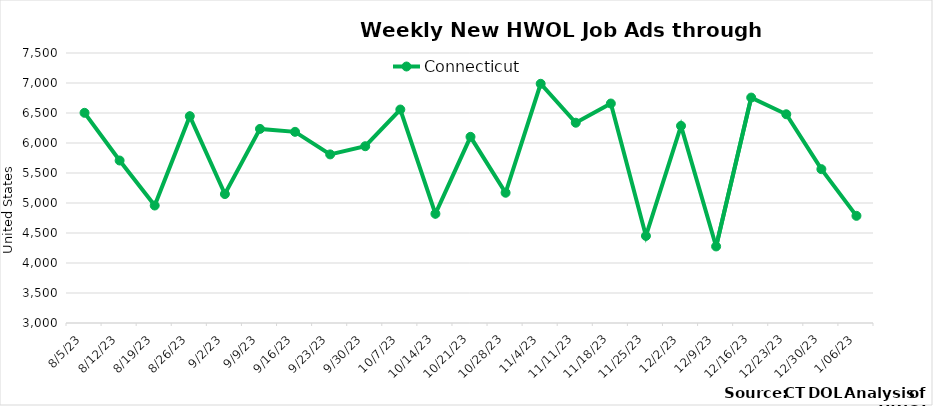
| Category | Connecticut |
|---|---|
| 8/5/23 | 6503 |
| 8/12/23 | 5708 |
| 8/19/23 | 4958 |
| 8/26/23 | 6447 |
| 9/2/23 | 5149 |
| 9/9/23 | 6235 |
| 9/16/23 | 6186 |
| 9/23/23 | 5810 |
| 9/30/23 | 5946 |
| 10/7/23 | 6558 |
| 10/14/23 | 4820 |
| 10/21/23 | 6103 |
| 10/28/23 | 5171 |
| 11/4/23 | 6987 |
| 11/11/23 | 6338 |
| 11/18/23 | 6658 |
| 11/25/23 | 4451 |
| 12/2/23 | 6286 |
| 12/9/23 | 4276 |
| 12/16/23 | 6757 |
|  12/23/23 | 6479 |
|  12/30/23 | 5564 |
|  1/06/23 | 4786 |